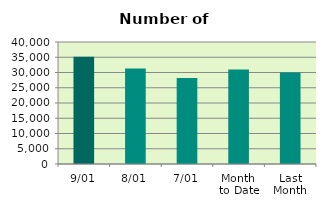
| Category | Series 0 |
|---|---|
| 9/01 | 35194 |
| 8/01 | 31350 |
| 7/01 | 28180 |
| Month 
to Date | 31009 |
| Last
Month | 29998.632 |